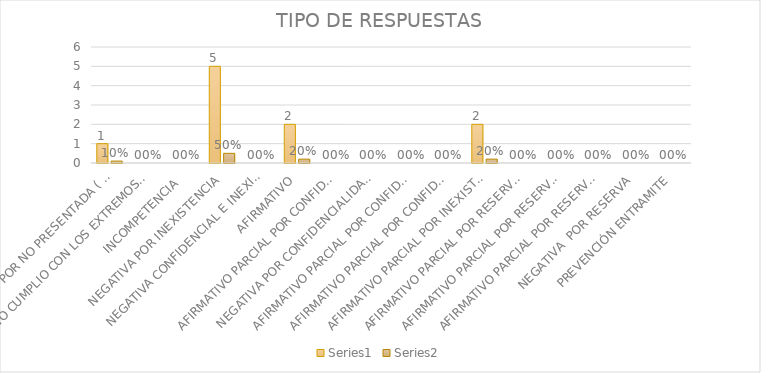
| Category | Series 4 | Series 5 |
|---|---|---|
| SE TIENE POR NO PRESENTADA ( NO CUMPLIÓ PREVENCIÓN) | 1 | 0.1 |
| NO CUMPLIO CON LOS EXTREMOS DEL ARTÍCULO 79 (REQUISITOS) | 0 | 0 |
| INCOMPETENCIA  | 0 | 0 |
| NEGATIVA POR INEXISTENCIA | 5 | 0.5 |
| NEGATIVA CONFIDENCIAL E INEXISTENTE | 0 | 0 |
| AFIRMATIVO | 2 | 0.2 |
| AFIRMATIVO PARCIAL POR CONFIDENCIALIDAD  | 0 | 0 |
| NEGATIVA POR CONFIDENCIALIDAD Y RESERVADA | 0 | 0 |
| AFIRMATIVO PARCIAL POR CONFIDENCIALIDAD E INEXISTENCIA | 0 | 0 |
| AFIRMATIVO PARCIAL POR CONFIDENCIALIDAD, RESERVA E INEXISTENCIA | 0 | 0 |
| AFIRMATIVO PARCIAL POR INEXISTENCIA | 2 | 0.2 |
| AFIRMATIVO PARCIAL POR RESERVA | 0 | 0 |
| AFIRMATIVO PARCIAL POR RESERVA Y CONFIDENCIALIDAD | 0 | 0 |
| AFIRMATIVO PARCIAL POR RESERVA E INEXISTENCIA | 0 | 0 |
| NEGATIVA  POR RESERVA | 0 | 0 |
| PREVENCIÓN ENTRAMITE | 0 | 0 |